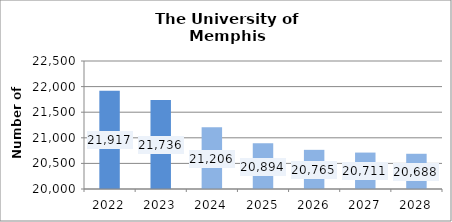
| Category | Series 0 |
|---|---|
| 2022.0 | 21917 |
| 2023.0 | 21736 |
| 2024.0 | 21206.107 |
| 2025.0 | 20893.775 |
| 2026.0 | 20764.811 |
| 2027.0 | 20711.407 |
| 2028.0 | 20688.022 |